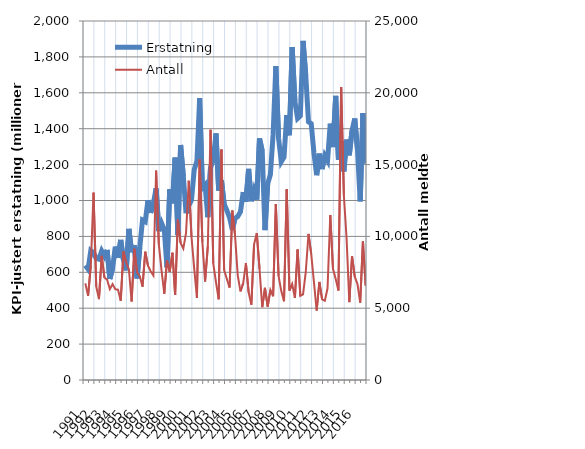
| Category | Erstatning |
|---|---|
| 1991.0 | 638.305 |
| nan | 617.49 |
| nan | 720.489 |
| nan | 708.243 |
| 1992.0 | 677.664 |
| nan | 673.336 |
| nan | 718.939 |
| nan | 690.111 |
| 1993.0 | 724.645 |
| nan | 562.774 |
| nan | 620.914 |
| nan | 743.095 |
| 1994.0 | 680.401 |
| nan | 780.53 |
| nan | 668.973 |
| nan | 610.787 |
| 1995.0 | 841.824 |
| nan | 711.536 |
| nan | 750.775 |
| nan | 566.189 |
| 1996.0 | 737.681 |
| nan | 891.182 |
| nan | 882.294 |
| nan | 1001.12 |
| 1997.0 | 931.155 |
| nan | 984.699 |
| nan | 1067.548 |
| nan | 829.951 |
| 1998.0 | 874.341 |
| nan | 837.865 |
| nan | 627.95 |
| nan | 1062.058 |
| 1999.0 | 984.04 |
| nan | 1239.159 |
| nan | 807.292 |
| nan | 1308.796 |
| 2000.0 | 1135.005 |
| nan | 928.869 |
| nan | 971.109 |
| nan | 1002.211 |
| 2001.0 | 1171.491 |
| nan | 1219.438 |
| nan | 1570.162 |
| nan | 1070.081 |
| 2002.0 | 1086.861 |
| nan | 907.106 |
| nan | 1183.634 |
| nan | 1224.277 |
| 2003.0 | 1373.705 |
| nan | 1054.474 |
| nan | 1113.11 |
| nan | 980.293 |
| 2004.0 | 945.444 |
| nan | 904.425 |
| nan | 836.38 |
| nan | 901.062 |
| 2005.0 | 910.826 |
| nan | 937.052 |
| nan | 1046.812 |
| nan | 993.378 |
| 2006.0 | 1176.283 |
| nan | 996.283 |
| nan | 1056.559 |
| nan | 1005.082 |
| 2007.0 | 1345.962 |
| nan | 1275.048 |
| nan | 835.366 |
| nan | 1092.832 |
| 2008.0 | 1144.621 |
| nan | 1369.428 |
| nan | 1748.539 |
| nan | 1346.977 |
| 2009.0 | 1216.204 |
| nan | 1241.686 |
| nan | 1475.828 |
| nan | 1363.591 |
| 2010.0 | 1854.723 |
| nan | 1552.135 |
| nan | 1457.291 |
| nan | 1471.348 |
| 2011.0 | 1889.184 |
| nan | 1694.934 |
| nan | 1438.377 |
| nan | 1427.875 |
| 2012.0 | 1264.734 |
| nan | 1141.025 |
| nan | 1260.942 |
| nan | 1174.868 |
| 2013.0 | 1250.053 |
| nan | 1222.343 |
| nan | 1427.919 |
| nan | 1297.809 |
| 2014.0 | 1583.326 |
| nan | 1227.429 |
| nan | 1331.604 |
| nan | 1162.233 |
| 2015.0 | 1339.019 |
| nan | 1251.691 |
| nan | 1390.064 |
| nan | 1456.52 |
| 2016.0 | 1285.825 |
| nan | 994.954 |
| nan | 1487.318 |
| nan | 1206.287 |